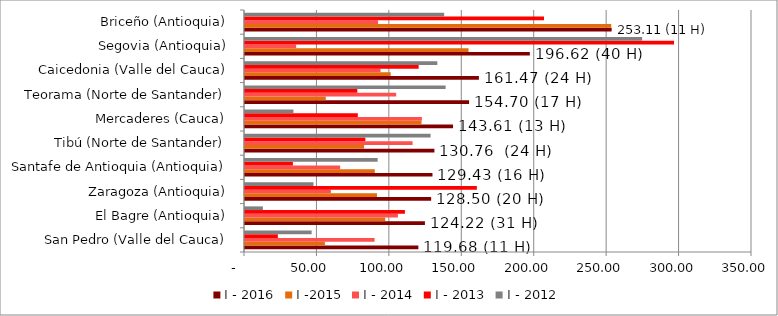
| Category | I - 2016 | I -2015 | I - 2014 | I - 2013 | I - 2012 |
|---|---|---|---|---|---|
| San Pedro (Valle del Cauca) | 119.676 | 55.163 | 89.46 | 22.682 | 45.993 |
| El Bagre (Antioquia) | 124.216 | 96.807 | 105.588 | 110.398 | 12.354 |
| Zaragoza (Antioquia) | 128.498 | 91.092 | 59.277 | 160.059 | 47.275 |
| Santafe de Antioquia (Antioquia) | 129.429 | 89.617 | 65.657 | 33.055 | 91.571 |
| Tibú (Norte de Santander) | 130.762 | 82.187 | 115.69 | 83.091 | 128.102 |
| Mercaderes (Cauca) | 143.607 | 121.809 | 122.1 | 77.877 | 33.45 |
| Teorama (Norte de Santander) | 154.7 | 55.752 | 104.34 | 77.527 | 138.504 |
| Caicedonia (Valle del Cauca) | 161.475 | 100.59 | 93.558 | 119.872 | 132.771 |
| Segovia (Antioquia) | 196.618 | 154.329 | 35.295 | 296.198 | 274.178 |
| Briceño (Antioquia) | 253.106 | 252.815 | 91.838 | 206.422 | 137.489 |